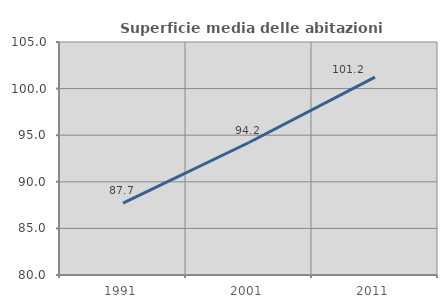
| Category | Superficie media delle abitazioni occupate |
|---|---|
| 1991.0 | 87.718 |
| 2001.0 | 94.215 |
| 2011.0 | 101.232 |